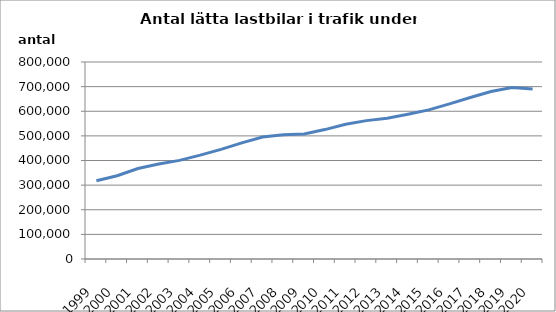
| Category | Series 0 |
|---|---|
| 1999.0 | 317665 |
| 2000.0 | 337939 |
| 2001.0 | 367472 |
| 2002.0 | 385708 |
| 2003.0 | 400511 |
| 2004.0 | 421708 |
| 2005.0 | 445394 |
| 2006.0 | 471809 |
| 2007.0 | 495214 |
| 2008.0 | 504850 |
| 2009.0 | 507566 |
| 2010.0 | 525547 |
| 2011.0 | 547033 |
| 2012.0 | 561948 |
| 2013.0 | 571800 |
| 2014.0 | 587802 |
| 2015.0 | 605470 |
| 2016.0 | 630096 |
| 2017.0 | 655881 |
| 2018.0 | 680384 |
| 2019.0 | 696742 |
| 2020.0 | 690216 |